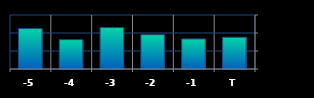
| Category | Series 0 |
|---|---|
| T | 352938 |
| -1 | 334128 |
| -2 | 381104 |
| -3 | 460484 |
| -4 | 325992 |
| -5 | 449428 |